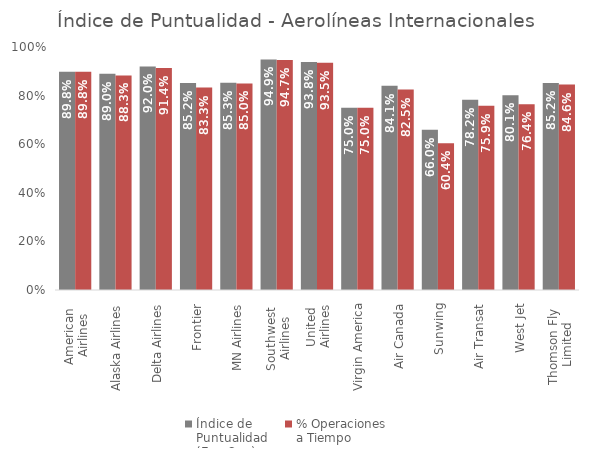
| Category | Índice de 
Puntualidad
(Ene-Sep) | % Operaciones 
a Tiempo |
|---|---|---|
| American 
Airlines | 0.898 | 0.898 |
| Alaska Airlines | 0.89 | 0.883 |
| Delta Airlines | 0.92 | 0.914 |
| Frontier | 0.852 | 0.833 |
| MN Airlines | 0.853 | 0.85 |
| Southwest 
Airlines | 0.949 | 0.947 |
| United 
Airlines | 0.938 | 0.935 |
| Virgin America | 0.75 | 0.75 |
| Air Canada | 0.841 | 0.825 |
| Sunwing | 0.66 | 0.604 |
| Air Transat | 0.782 | 0.759 |
| West Jet | 0.801 | 0.764 |
| Thomson Fly 
Limited | 0.852 | 0.846 |